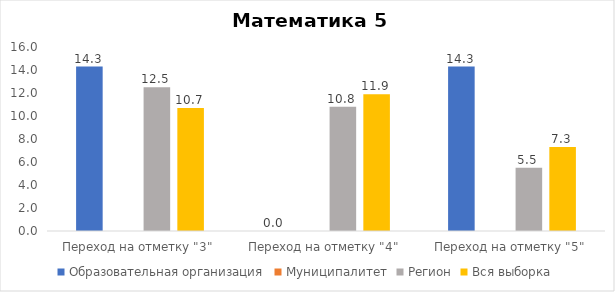
| Category | Образовательная организация | Муниципалитет | Регион | Вся выборка |
|---|---|---|---|---|
| Переход на отметку "3" | 14.3 |  | 12.5 | 10.7 |
| Переход на отметку "4" | 0 |  | 10.8 | 11.9 |
| Переход на отметку "5" | 14.3 |  | 5.5 | 7.3 |